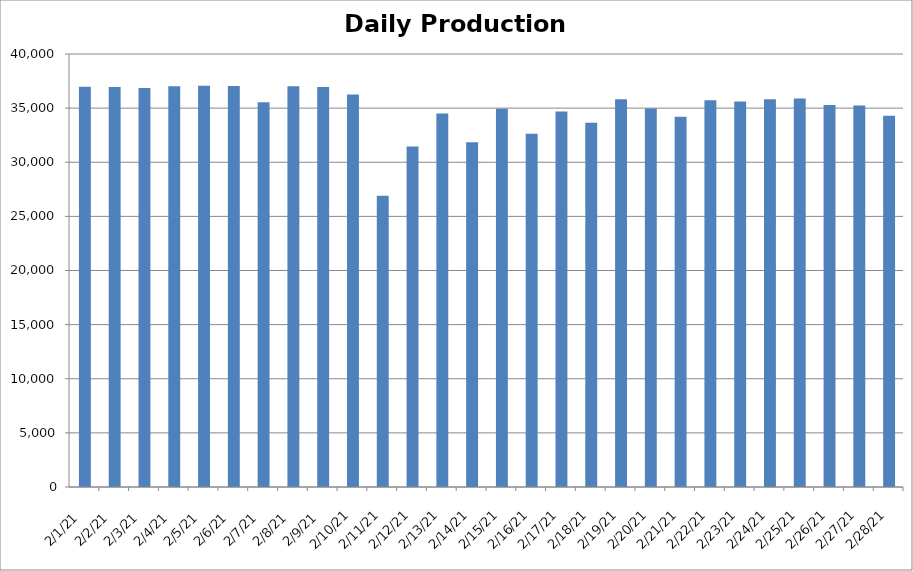
| Category | Cogen Daily Production (kWh) |
|---|---|
| 2/1/21 | 36968.75 |
| 2/2/21 | 36947.75 |
| 2/3/21 | 36849 |
| 2/4/21 | 37021 |
| 2/5/21 | 37059.75 |
| 2/6/21 | 37035.5 |
| 2/7/21 | 35549.5 |
| 2/8/21 | 37020 |
| 2/9/21 | 36954 |
| 2/10/21 | 36249 |
| 2/11/21 | 26904.5 |
| 2/12/21 | 31461.25 |
| 2/13/21 | 34505.75 |
| 2/14/21 | 31855.75 |
| 2/15/21 | 34948.25 |
| 2/16/21 | 32632.75 |
| 2/17/21 | 34687 |
| 2/18/21 | 33656.5 |
| 2/19/21 | 35820.5 |
| 2/20/21 | 34962.5 |
| 2/21/21 | 34205 |
| 2/22/21 | 35731 |
| 2/23/21 | 35601.25 |
| 2/24/21 | 35814 |
| 2/25/21 | 35881 |
| 2/26/21 | 35292.75 |
| 2/27/21 | 35243.75 |
| 2/28/21 | 34299.25 |